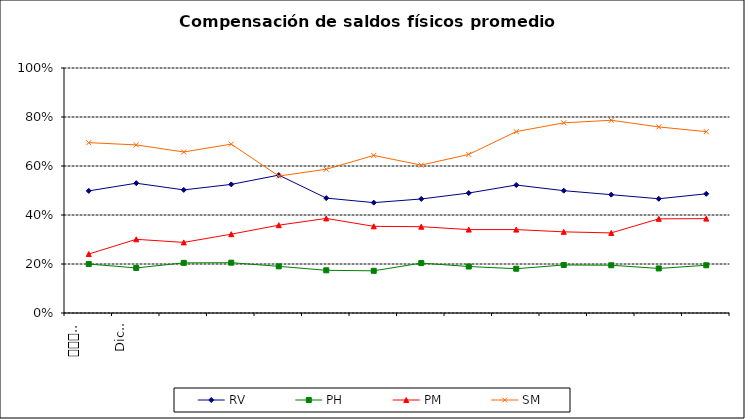
| Category | RV | PH | PM | SM |
|---|---|---|---|---|
| 0 | 0.498 | 0.2 | 0.241 | 0.695 |
| 1 | 0.53 | 0.184 | 0.301 | 0.686 |
| 2 | 0.502 | 0.205 | 0.288 | 0.657 |
| 3 | 0.525 | 0.205 | 0.322 | 0.689 |
| 4 | 0.563 | 0.19 | 0.358 | 0.559 |
| 5 | 0.469 | 0.174 | 0.386 | 0.587 |
| 6 | 0.45 | 0.172 | 0.354 | 0.643 |
| 7 | 0.465 | 0.204 | 0.352 | 0.604 |
| 8 | 0.49 | 0.19 | 0.34 | 0.647 |
| 9 | 0.522 | 0.181 | 0.34 | 0.74 |
| 10 | 0.499 | 0.196 | 0.331 | 0.776 |
| 11 | 0.483 | 0.195 | 0.327 | 0.787 |
| 12 | 0.466 | 0.182 | 0.384 | 0.759 |
| 13 | 0.486 | 0.195 | 0.385 | 0.74 |